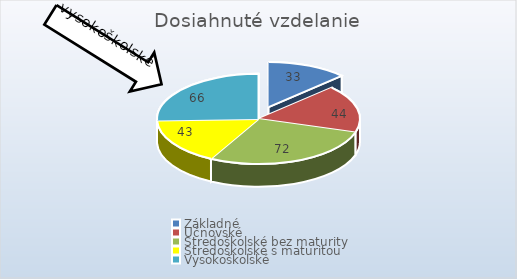
| Category | Series 0 |
|---|---|
| Základné | 33 |
| Učnovské | 44 |
| Stredoškolské bez maturity | 72 |
| Stredoškolské s maturitou | 43 |
| Vysokoškolské | 66 |